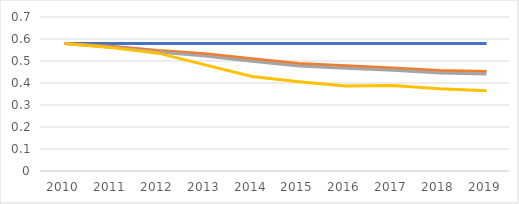
| Category | 2010 award rate | Impact of business cycle | Impact of field offices | Observed award rate |
|---|---|---|---|---|
| 2010.0 | 0.579 | 0.579 | 0.579 | 0.579 |
| 2011.0 | 0.579 | 0.568 | 0.563 | 0.561 |
| 2012.0 | 0.579 | 0.548 | 0.541 | 0.536 |
| 2013.0 | 0.579 | 0.533 | 0.522 | 0.483 |
| 2014.0 | 0.579 | 0.511 | 0.499 | 0.43 |
| 2015.0 | 0.579 | 0.489 | 0.478 | 0.405 |
| 2016.0 | 0.579 | 0.478 | 0.467 | 0.386 |
| 2017.0 | 0.579 | 0.469 | 0.457 | 0.389 |
| 2018.0 | 0.579 | 0.457 | 0.445 | 0.374 |
| 2019.0 | 0.579 | 0.453 | 0.441 | 0.365 |